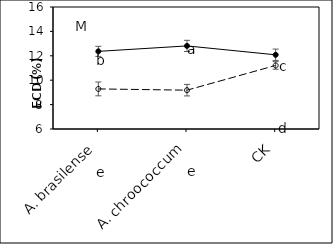
| Category | aCO2 | eCO2 |
|---|---|---|
|    A. brasilense | 12.363 | 9.286 |
|    A. chroococcum | 12.81 | 9.182 |
| CK | 12.08 | 11.209 |